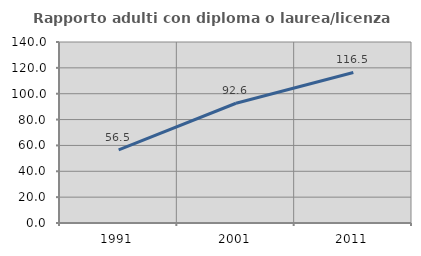
| Category | Rapporto adulti con diploma o laurea/licenza media  |
|---|---|
| 1991.0 | 56.481 |
| 2001.0 | 92.636 |
| 2011.0 | 116.456 |